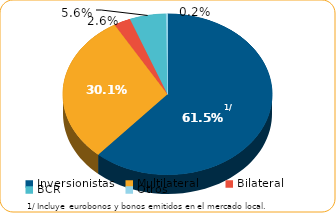
| Category | Series 0 |
|---|---|
| Inversionistas | 7754.8 |
| Multilateral | 3793.9 |
| Bilateral | 325.8 |
| BCR | 704.3 |
| Otros | 31.7 |